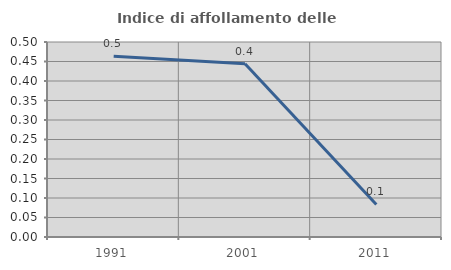
| Category | Indice di affollamento delle abitazioni  |
|---|---|
| 1991.0 | 0.463 |
| 2001.0 | 0.444 |
| 2011.0 | 0.083 |